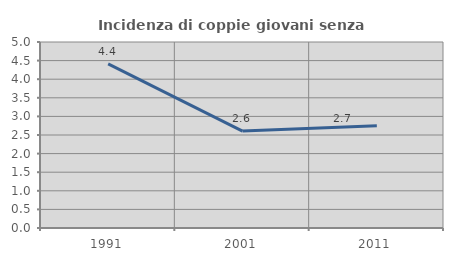
| Category | Incidenza di coppie giovani senza figli |
|---|---|
| 1991.0 | 4.412 |
| 2001.0 | 2.605 |
| 2011.0 | 2.75 |